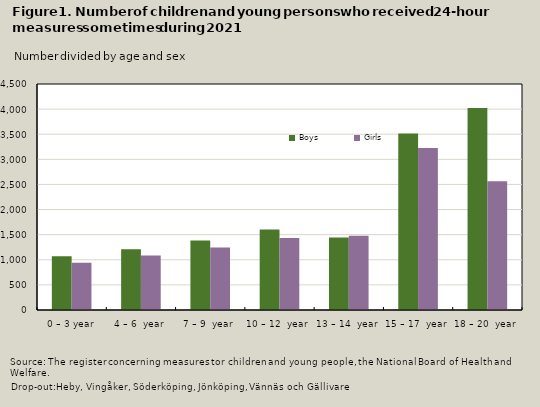
| Category | Boys | Girls |
|---|---|---|
| 0 – 3 year | 1068 | 942 |
| 4 – 6  year | 1212 | 1083 |
| 7 – 9  year | 1382 | 1243 |
| 10 – 12  year | 1604 | 1434 |
| 13 – 14  year | 1443 | 1479 |
| 15 – 17  year | 3515 | 3224 |
| 18 – 20  year | 4021 | 2565 |